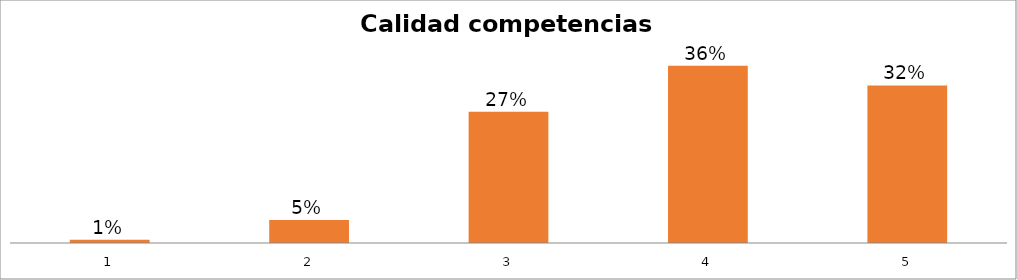
| Category | Series 1 |
|---|---|
| 0 | 0.007 |
| 1 | 0.047 |
| 2 | 0.267 |
| 3 | 0.36 |
| 4 | 0.32 |